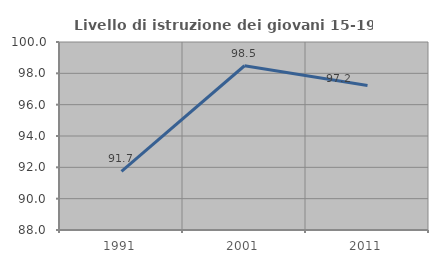
| Category | Livello di istruzione dei giovani 15-19 anni |
|---|---|
| 1991.0 | 91.743 |
| 2001.0 | 98.485 |
| 2011.0 | 97.222 |